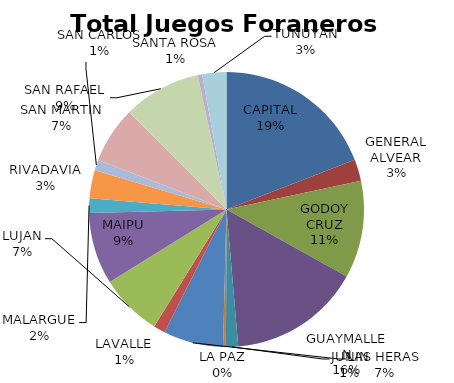
| Category | Total Juegos Foraneros Beneficio |
|---|---|
| CAPITAL | 844161.36 |
| GENERAL ALVEAR | 111385.55 |
| GODOY CRUZ | 505565.37 |
| GUAYMALLEN | 686830.87 |
| JUNIN | 63123.75 |
| LA PAZ | 14753.65 |
| LAS HERAS | 311279.12 |
| LAVALLE | 60378.29 |
| LUJAN | 323689.81 |
| MAIPU | 373701.03 |
| MALARGUE | 74593.72 |
| RIVADAVIA | 146352.16 |
| SAN CARLOS | 55160.25 |
| SAN MARTIN | 292772.31 |
| SAN RAFAEL  | 403732.13 |
| SANTA ROSA | 23316.24 |
| TUNUYAN | 125420.85 |